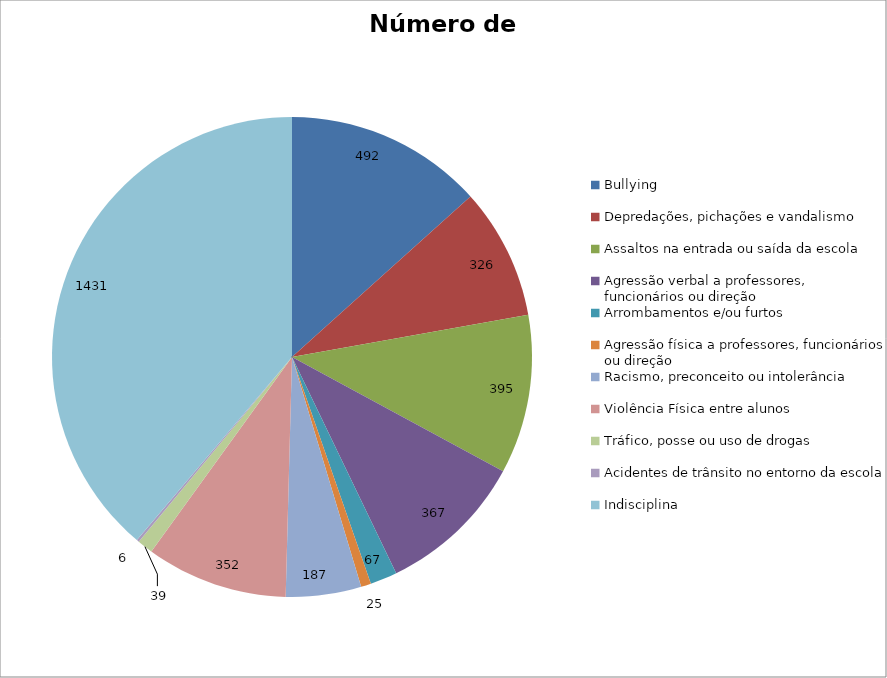
| Category | Número de Casos |
|---|---|
| Bullying | 492 |
| Depredações, pichações e vandalismo | 326 |
| Assaltos na entrada ou saída da escola | 395 |
| Agressão verbal a professores, funcionários ou direção | 367 |
| Arrombamentos e/ou furtos | 67 |
| Agressão física a professores, funcionários ou direção | 25 |
| Racismo, preconceito ou intolerância | 187 |
| Violência Física entre alunos | 352 |
| Tráfico, posse ou uso de drogas | 39 |
| Acidentes de trânsito no entorno da escola | 6 |
| Indisciplina | 1431 |